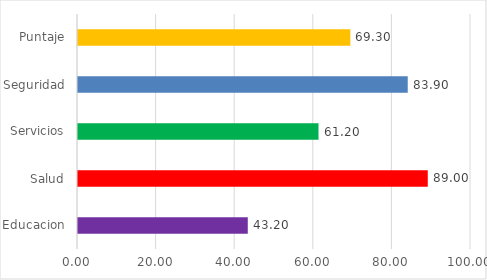
| Category | Series 0 |
|---|---|
| Educacion | 43.2 |
| Salud | 89 |
| Servicios | 61.2 |
| Seguridad | 83.9 |
| Puntaje | 69.3 |